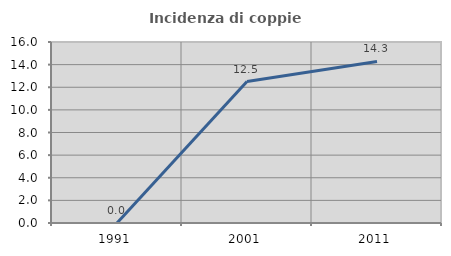
| Category | Incidenza di coppie miste |
|---|---|
| 1991.0 | 0 |
| 2001.0 | 12.5 |
| 2011.0 | 14.286 |